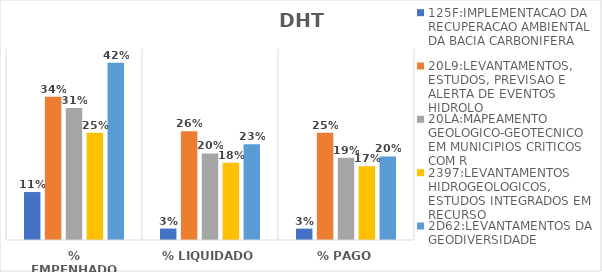
| Category | 125F:IMPLEMENTACAO DA RECUPERACAO AMBIENTAL DA BACIA CARBONIFERA | 20L9:LEVANTAMENTOS, ESTUDOS, PREVISAO E ALERTA DE EVENTOS HIDROLO | 20LA:MAPEAMENTO GEOLOGICO-GEOTECNICO EM MUNICIPIOS CRITICOS COM R | 2397:LEVANTAMENTOS HIDROGEOLOGICOS, ESTUDOS INTEGRADOS EM RECURSO | 2D62:LEVANTAMENTOS DA GEODIVERSIDADE |
|---|---|---|---|---|---|
| % EMPENHADO | 0.113 | 0.338 | 0.311 | 0.253 | 0.417 |
| % LIQUIDADO | 0.027 | 0.256 | 0.204 | 0.182 | 0.226 |
| % PAGO | 0.027 | 0.252 | 0.194 | 0.174 | 0.197 |